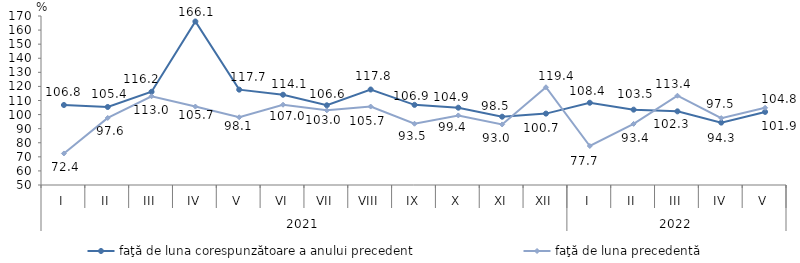
| Category | faţă de luna corespunzătoare a anului precedent | faţă de luna precedentă   |
|---|---|---|
| 0 | 106.8 | 72.4 |
| 1 | 105.4 | 97.6 |
| 2 | 116.2 | 113 |
| 3 | 166.1 | 105.7 |
| 4 | 117.7 | 98.1 |
| 5 | 114.1 | 107 |
| 6 | 106.6 | 103 |
| 7 | 117.8 | 105.7 |
| 8 | 106.9 | 93.5 |
| 9 | 104.9 | 99.4 |
| 10 | 98.5 | 93 |
| 11 | 100.7 | 119.4 |
| 12 | 108.4 | 77.7 |
| 13 | 103.5 | 93.4 |
| 14 | 102.3 | 113.4 |
| 15 | 94.3 | 97.5 |
| 16 | 101.9 | 104.8 |